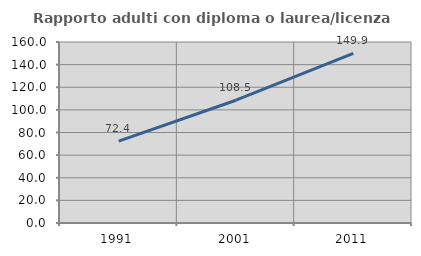
| Category | Rapporto adulti con diploma o laurea/licenza media  |
|---|---|
| 1991.0 | 72.364 |
| 2001.0 | 108.541 |
| 2011.0 | 149.922 |